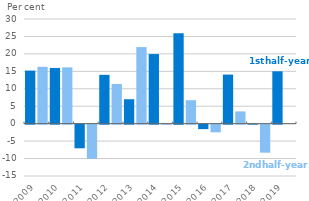
| Category | 1st half-year | 2nd half-year |
|---|---|---|
| 2009 | 15.208 | 16.292 |
| 2010 | 15.972 | 16.14 |
| 2011 | -6.767 | -9.772 |
| 2012 | 13.999 | 11.382 |
| 2013 | 7.002 | 21.947 |
| 2014 | 19.955 | -0.021 |
| 2015 | 25.931 | 6.724 |
| 2016 | -1.275 | -2.195 |
| 2017 | 14.071 | 3.516 |
| 2018 | -0.004 | -8.028 |
| 2019 | 15.012 | 0 |